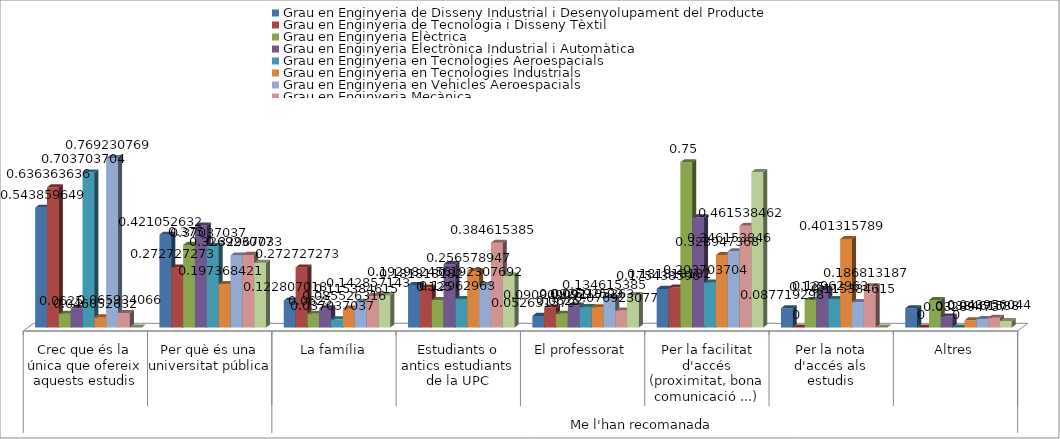
| Category | Grau en Enginyeria de Disseny Industrial i Desenvolupament del Producte | Grau en Enginyeria de Tecnologia i Disseny Tèxtil | Grau en Enginyeria Elèctrica | Grau en Enginyeria Electrònica Industrial i Automàtica | Grau en Enginyeria en Tecnologies Aeroespacials | Grau en Enginyeria en Tecnologies Industrials | Grau en Enginyeria en Vehicles Aeroespacials | Grau en Enginyeria Mecànica | Grau en Enginyeria Química |
|---|---|---|---|---|---|---|---|---|---|
| 0 | 0.544 | 0.636 | 0.062 | 0.088 | 0.704 | 0.046 | 0.769 | 0.066 | 0 |
| 1 | 0.421 | 0.273 | 0.375 | 0.462 | 0.37 | 0.197 | 0.327 | 0.33 | 0.294 |
| 2 | 0.123 | 0.273 | 0.062 | 0.088 | 0.037 | 0.086 | 0.115 | 0.143 | 0.147 |
| 3 | 0.193 | 0.182 | 0.125 | 0.288 | 0.13 | 0.257 | 0.192 | 0.385 | 0.235 |
| 4 | 0.053 | 0.091 | 0.062 | 0.1 | 0.093 | 0.092 | 0.135 | 0.077 | 0.147 |
| 5 | 0.175 | 0.182 | 0.75 | 0.5 | 0.204 | 0.329 | 0.346 | 0.462 | 0.706 |
| 6 | 0.088 | 0 | 0.125 | 0.175 | 0.13 | 0.401 | 0.115 | 0.187 | 0 |
| 7 | 0.088 | 0 | 0.125 | 0.05 | 0 | 0.033 | 0.038 | 0.044 | 0.029 |